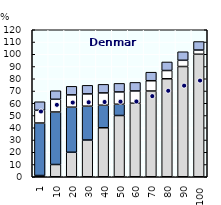
| Category | Gross earnings | Social assistance | Housing benefits | Family benefits | In-work benefits |
|---|---|---|---|---|---|
| 1.0 | 1 | 42.862 | 10.389 | 6.975 | 0 |
| 10.0 | 10 | 42.862 | 10.389 | 6.975 | 0 |
| 20.0 | 20 | 36.807 | 10.041 | 6.975 | 0 |
| 30.0 | 30 | 27.607 | 10.041 | 6.975 | 0 |
| 40.0 | 40 | 18.407 | 10.041 | 6.975 | 0 |
| 50.0 | 50 | 9.207 | 10.041 | 6.975 | 0 |
| 60.0 | 60 | 0.007 | 10.041 | 6.975 | 0 |
| 70.0 | 70 | 0 | 8.387 | 6.975 | 0 |
| 80.0 | 80 | 0 | 6.731 | 6.975 | 0 |
| 90.0 | 90 | 0 | 5.075 | 6.975 | 0 |
| 100.0 | 100 | 0 | 3.419 | 6.975 | 0 |